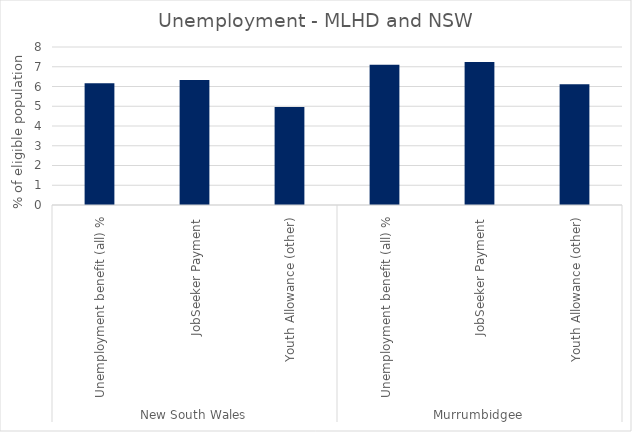
| Category | Total |
|---|---|
| 0 | 6.167 |
| 1 | 6.323 |
| 2 | 4.966 |
| 3 | 7.098 |
| 4 | 7.244 |
| 5 | 6.111 |